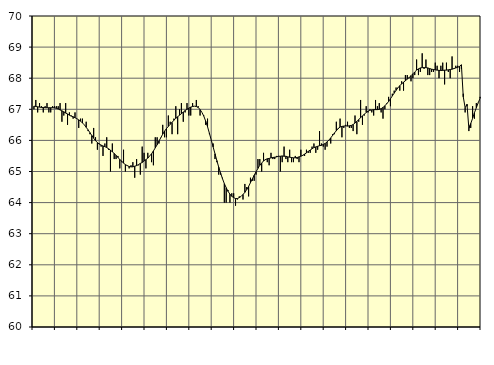
| Category | Piggar | Series 1 |
|---|---|---|
| nan | 67 | 67.1 |
| 1.0 | 67.3 | 67.09 |
| 1.0 | 66.9 | 67.08 |
| 1.0 | 67.2 | 67.07 |
| 1.0 | 67.1 | 67.06 |
| 1.0 | 66.9 | 67.06 |
| 1.0 | 67.1 | 67.05 |
| 1.0 | 67.2 | 67.05 |
| 1.0 | 66.9 | 67.05 |
| 1.0 | 66.9 | 67.05 |
| 1.0 | 67.1 | 67.05 |
| 1.0 | 67.1 | 67.05 |
| nan | 67.1 | 67.03 |
| 2.0 | 67.1 | 67.01 |
| 2.0 | 67.2 | 66.98 |
| 2.0 | 66.6 | 66.95 |
| 2.0 | 66.8 | 66.92 |
| 2.0 | 67.2 | 66.88 |
| 2.0 | 66.5 | 66.85 |
| 2.0 | 66.9 | 66.81 |
| 2.0 | 66.8 | 66.78 |
| 2.0 | 66.7 | 66.76 |
| 2.0 | 66.9 | 66.73 |
| 2.0 | 66.7 | 66.7 |
| nan | 66.4 | 66.66 |
| 3.0 | 66.7 | 66.62 |
| 3.0 | 66.7 | 66.56 |
| 3.0 | 66.5 | 66.5 |
| 3.0 | 66.6 | 66.42 |
| 3.0 | 66.3 | 66.34 |
| 3.0 | 66.2 | 66.25 |
| 3.0 | 65.9 | 66.16 |
| 3.0 | 66.4 | 66.07 |
| 3.0 | 66.1 | 65.99 |
| 3.0 | 65.7 | 65.93 |
| 3.0 | 65.9 | 65.88 |
| nan | 65.8 | 65.85 |
| 4.0 | 65.5 | 65.82 |
| 4.0 | 65.9 | 65.8 |
| 4.0 | 66.1 | 65.77 |
| 4.0 | 65.7 | 65.73 |
| 4.0 | 65 | 65.69 |
| 4.0 | 65.9 | 65.63 |
| 4.0 | 65.4 | 65.58 |
| 4.0 | 65.4 | 65.52 |
| 4.0 | 65.5 | 65.45 |
| 4.0 | 65.1 | 65.39 |
| 4.0 | 65.3 | 65.33 |
| nan | 65.7 | 65.27 |
| 5.0 | 65 | 65.22 |
| 5.0 | 65.2 | 65.19 |
| 5.0 | 65.1 | 65.16 |
| 5.0 | 65.2 | 65.15 |
| 5.0 | 65.3 | 65.15 |
| 5.0 | 64.8 | 65.17 |
| 5.0 | 65.4 | 65.19 |
| 5.0 | 65.2 | 65.22 |
| 5.0 | 64.9 | 65.26 |
| 5.0 | 65.8 | 65.29 |
| 5.0 | 65.6 | 65.34 |
| nan | 65.1 | 65.38 |
| 6.0 | 65.6 | 65.43 |
| 6.0 | 65.5 | 65.5 |
| 6.0 | 65.3 | 65.57 |
| 6.0 | 65.2 | 65.66 |
| 6.0 | 66.1 | 65.76 |
| 6.0 | 66.1 | 65.86 |
| 6.0 | 65.9 | 65.98 |
| 6.0 | 66.1 | 66.09 |
| 6.0 | 66.5 | 66.2 |
| 6.0 | 66.1 | 66.3 |
| 6.0 | 66.1 | 66.38 |
| nan | 66.8 | 66.45 |
| 7.0 | 66.6 | 66.52 |
| 7.0 | 66.2 | 66.58 |
| 7.0 | 66.7 | 66.65 |
| 7.0 | 67.1 | 66.71 |
| 7.0 | 66.2 | 66.76 |
| 7.0 | 67 | 66.81 |
| 7.0 | 67.2 | 66.86 |
| 7.0 | 66.6 | 66.91 |
| 7.0 | 66.9 | 66.96 |
| 7.0 | 67.2 | 67 |
| 7.0 | 66.8 | 67.04 |
| nan | 66.8 | 67.07 |
| 8.0 | 67.2 | 67.09 |
| 8.0 | 67.1 | 67.1 |
| 8.0 | 67.3 | 67.09 |
| 8.0 | 67.1 | 67.06 |
| 8.0 | 66.8 | 66.99 |
| 8.0 | 66.9 | 66.9 |
| 8.0 | 66.8 | 66.78 |
| 8.0 | 66.5 | 66.62 |
| 8.0 | 66.7 | 66.44 |
| 8.0 | 66.2 | 66.23 |
| 8.0 | 66 | 66.01 |
| nan | 65.9 | 65.79 |
| 9.0 | 65.4 | 65.57 |
| 9.0 | 65.3 | 65.35 |
| 9.0 | 64.9 | 65.14 |
| 9.0 | 64.9 | 64.95 |
| 9.0 | 64.8 | 64.77 |
| 9.0 | 64 | 64.61 |
| 9.0 | 64 | 64.48 |
| 9.0 | 64.4 | 64.36 |
| 9.0 | 64 | 64.27 |
| 9.0 | 64.3 | 64.2 |
| 9.0 | 64.3 | 64.16 |
| nan | 63.9 | 64.13 |
| 10.0 | 64.1 | 64.13 |
| 10.0 | 64.2 | 64.16 |
| 10.0 | 64.2 | 64.2 |
| 10.0 | 64.1 | 64.26 |
| 10.0 | 64.6 | 64.33 |
| 10.0 | 64.5 | 64.42 |
| 10.0 | 64.2 | 64.52 |
| 10.0 | 64.8 | 64.64 |
| 10.0 | 64.7 | 64.76 |
| 10.0 | 64.7 | 64.88 |
| 10.0 | 64.9 | 64.99 |
| nan | 65.4 | 65.1 |
| 11.0 | 65.4 | 65.2 |
| 11.0 | 65 | 65.27 |
| 11.0 | 65.6 | 65.34 |
| 11.0 | 65.4 | 65.38 |
| 11.0 | 65.3 | 65.41 |
| 11.0 | 65.2 | 65.42 |
| 11.0 | 65.6 | 65.44 |
| 11.0 | 65.4 | 65.45 |
| 11.0 | 65.4 | 65.46 |
| 11.0 | 65.5 | 65.47 |
| 11.0 | 65.5 | 65.49 |
| nan | 65 | 65.49 |
| 12.0 | 65.3 | 65.5 |
| 12.0 | 65.8 | 65.49 |
| 12.0 | 65.4 | 65.49 |
| 12.0 | 65.3 | 65.47 |
| 12.0 | 65.7 | 65.46 |
| 12.0 | 65.3 | 65.45 |
| 12.0 | 65.3 | 65.44 |
| 12.0 | 65.5 | 65.44 |
| 12.0 | 65.4 | 65.45 |
| 12.0 | 65.3 | 65.47 |
| 12.0 | 65.7 | 65.49 |
| nan | 65.5 | 65.52 |
| 13.0 | 65.5 | 65.56 |
| 13.0 | 65.7 | 65.6 |
| 13.0 | 65.6 | 65.65 |
| 13.0 | 65.6 | 65.69 |
| 13.0 | 65.8 | 65.73 |
| 13.0 | 65.9 | 65.77 |
| 13.0 | 65.6 | 65.79 |
| 13.0 | 65.7 | 65.81 |
| 13.0 | 66.3 | 65.83 |
| 13.0 | 65.9 | 65.84 |
| 13.0 | 65.8 | 65.87 |
| nan | 65.7 | 65.9 |
| 14.0 | 65.8 | 65.95 |
| 14.0 | 66 | 66.01 |
| 14.0 | 65.9 | 66.08 |
| 14.0 | 66.2 | 66.16 |
| 14.0 | 66.2 | 66.24 |
| 14.0 | 66.6 | 66.31 |
| 14.0 | 66.4 | 66.38 |
| 14.0 | 66.7 | 66.43 |
| 14.0 | 66.1 | 66.45 |
| 14.0 | 66.4 | 66.46 |
| 14.0 | 66.5 | 66.47 |
| nan | 66.6 | 66.46 |
| 15.0 | 66.4 | 66.47 |
| 15.0 | 66.4 | 66.48 |
| 15.0 | 66.3 | 66.51 |
| 15.0 | 66.8 | 66.56 |
| 15.0 | 66.2 | 66.61 |
| 15.0 | 66.6 | 66.67 |
| 15.0 | 67.3 | 66.73 |
| 15.0 | 66.5 | 66.79 |
| 15.0 | 66.8 | 66.84 |
| 15.0 | 67.1 | 66.9 |
| 15.0 | 66.9 | 66.94 |
| nan | 67 | 66.97 |
| 16.0 | 66.9 | 66.98 |
| 16.0 | 66.8 | 66.99 |
| 16.0 | 67.3 | 66.99 |
| 16.0 | 67.1 | 66.99 |
| 16.0 | 67.2 | 67 |
| 16.0 | 66.9 | 67.02 |
| 16.0 | 66.7 | 67.06 |
| 16.0 | 67 | 67.11 |
| 16.0 | 67.2 | 67.18 |
| 16.0 | 67.4 | 67.25 |
| 16.0 | 67.1 | 67.34 |
| nan | 67.5 | 67.43 |
| 17.0 | 67.6 | 67.52 |
| 17.0 | 67.7 | 67.61 |
| 17.0 | 67.7 | 67.69 |
| 17.0 | 67.6 | 67.76 |
| 17.0 | 67.9 | 67.82 |
| 17.0 | 67.6 | 67.87 |
| 17.0 | 68.1 | 67.92 |
| 17.0 | 68.1 | 67.97 |
| 17.0 | 68 | 68.02 |
| 17.0 | 67.9 | 68.08 |
| 17.0 | 68 | 68.14 |
| nan | 68.1 | 68.2 |
| 18.0 | 68.6 | 68.26 |
| 18.0 | 68.1 | 68.3 |
| 18.0 | 68.2 | 68.33 |
| 18.0 | 68.8 | 68.34 |
| 18.0 | 68.3 | 68.34 |
| 18.0 | 68.6 | 68.34 |
| 18.0 | 68.1 | 68.33 |
| 18.0 | 68.1 | 68.31 |
| 18.0 | 68.2 | 68.29 |
| 18.0 | 68.2 | 68.28 |
| 18.0 | 68.5 | 68.27 |
| nan | 68.4 | 68.26 |
| 19.0 | 68 | 68.25 |
| 19.0 | 68.4 | 68.25 |
| 19.0 | 68.5 | 68.25 |
| 19.0 | 67.8 | 68.26 |
| 19.0 | 68.5 | 68.26 |
| 19.0 | 68.2 | 68.27 |
| 19.0 | 68 | 68.28 |
| 19.0 | 68.7 | 68.29 |
| 19.0 | 68.3 | 68.31 |
| 19.0 | 68.4 | 68.33 |
| 19.0 | 68.4 | 68.35 |
| nan | 68.2 | 68.38 |
| 20.0 | 68.3 | 68.43 |
| 20.0 | 67.5 | 67.4 |
| 20.0 | 66.9 | 67.05 |
| 20.0 | 67.1 | 67.16 |
| 20.0 | 66.3 | 66.38 |
| 20.0 | 66.4 | 66.54 |
| 20.0 | 67.1 | 66.71 |
| 20.0 | 66.7 | 66.89 |
| 20.0 | 67.2 | 67.05 |
| 20.0 | 67.2 | 67.21 |
| 20.0 | 67.4 | 67.35 |